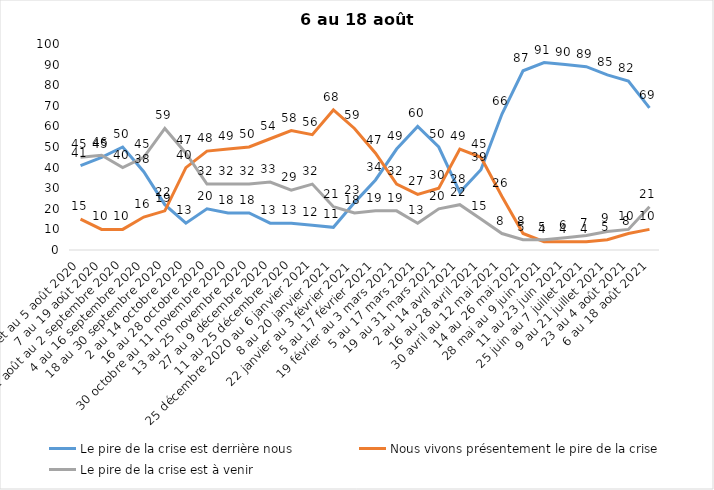
| Category | Le pire de la crise est derrière nous | Nous vivons présentement le pire de la crise | Le pire de la crise est à venir |
|---|---|---|---|
| 24 juillet au 5 août 2020 | 41 | 15 | 45 |
| 7 au 19 août 2020 | 45 | 10 | 46 |
| 21 août au 2 septembre 2020 | 50 | 10 | 40 |
| 4 au 16 septembre 2020 | 38 | 16 | 45 |
| 18 au 30 septembre 2020 | 22 | 19 | 59 |
| 2 au 14 octobre 2020 | 13 | 40 | 47 |
| 16 au 28 octobre 2020 | 20 | 48 | 32 |
| 30 octobre au 11 novembre 2020 | 18 | 49 | 32 |
| 13 au 25 novembre 2020 | 18 | 50 | 32 |
| 27 au 9 décembre 2020 | 13 | 54 | 33 |
| 11 au 25 décembre 2020 | 13 | 58 | 29 |
| 25 décembre 2020 au 6 janvier 2021 | 12 | 56 | 32 |
| 8 au 20 janvier 2021 | 11 | 68 | 21 |
| 22 janvier au 3 février 2021 | 23 | 59 | 18 |
| 5 au 17 février 2021 | 34 | 47 | 19 |
| 19 février au 3 mars 2021 | 49 | 32 | 19 |
| 5 au 17 mars 2021 | 60 | 27 | 13 |
| 19 au 31 mars 2021 | 50 | 30 | 20 |
| 2 au 14 avril 2021 | 28 | 49 | 22 |
| 16 au 28 avril 2021 | 39 | 45 | 15 |
| 30 avril au 12 mai 2021 | 66 | 26 | 8 |
| 14 au 26 mai 2021 | 87 | 8 | 5 |
| 28 mai au 9 juin 2021 | 91 | 4 | 5 |
| 11 au 23 juin 2021 | 90 | 4 | 6 |
| 25 juin au 7 juillet 2021 | 89 | 4 | 7 |
| 9 au 21 juillet 2021 | 85 | 5 | 9 |
| 23 au 4 août 2021 | 82 | 8 | 10 |
| 6 au 18 août 2021 | 69 | 10 | 21 |